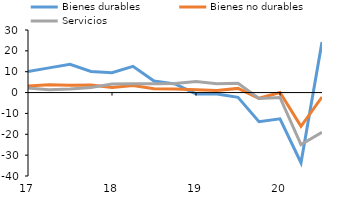
| Category | Bienes durables | Bienes no durables | Servicios |
|---|---|---|---|
| 2017-03-01 | 10.045 | 3.151 | 2.181 |
| 2017-06-01 | 11.842 | 3.755 | 1.402 |
| 2017-09-01 | 13.511 | 3.47 | 1.77 |
| 2017-12-01 | 10.083 | 3.589 | 2.433 |
| 2018-03-01 | 9.482 | 2.411 | 4.096 |
| 2018-06-01 | 12.558 | 3.35 | 4.219 |
| 2018-09-01 | 5.554 | 1.852 | 4.191 |
| 2018-12-01 | 4.1 | 1.755 | 4.305 |
| 2019-03-01 | -0.675 | 1.306 | 5.254 |
| 2019-06-01 | -0.719 | 0.987 | 4.27 |
| 2019-09-01 | -2.284 | 1.997 | 4.489 |
| 2019-12-01 | -13.944 | -2.751 | -2.847 |
| 2020-03-01 | -12.561 | 0.053 | -2.352 |
| 2020-06-01 | -33.655 | -16.153 | -24.976 |
| 2020-09-01 | 24.26 | -2.139 | -19.068 |